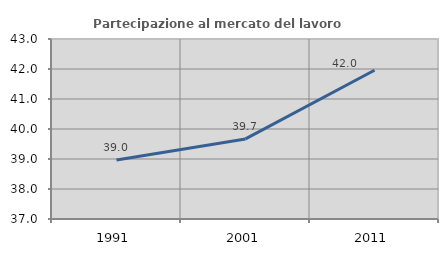
| Category | Partecipazione al mercato del lavoro  femminile |
|---|---|
| 1991.0 | 38.966 |
| 2001.0 | 39.669 |
| 2011.0 | 41.958 |